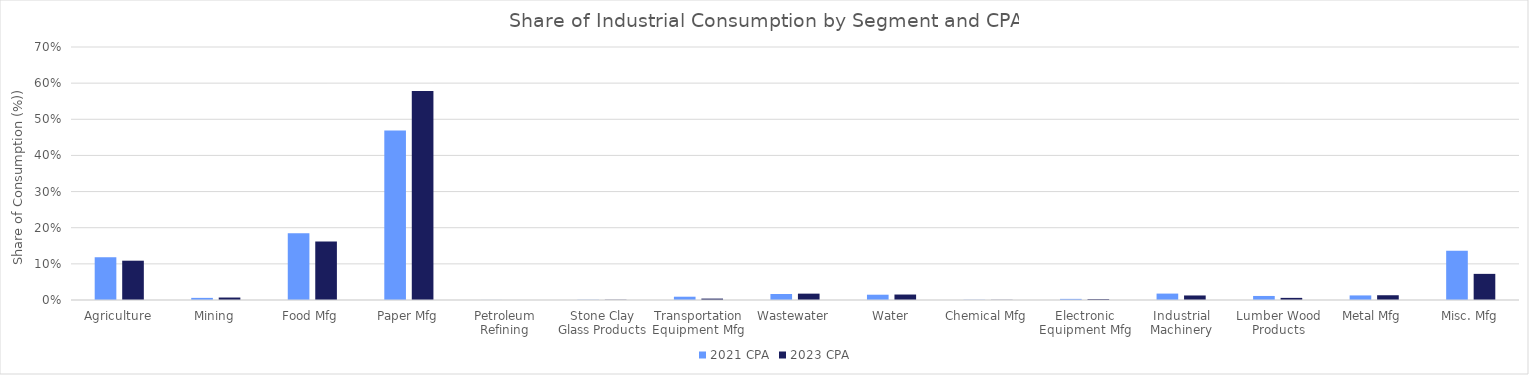
| Category | 2021 CPA | 2023 CPA |
|---|---|---|
| Agriculture | 0.118 | 0.109 |
| Mining | 0.006 | 0.007 |
| Food Mfg | 0.184 | 0.162 |
| Paper Mfg | 0.469 | 0.578 |
| Petroleum Refining | 0 | 0 |
| Stone Clay Glass Products | 0.001 | 0.001 |
| Transportation Equipment Mfg | 0.009 | 0.004 |
| Wastewater | 0.017 | 0.018 |
| Water | 0.015 | 0.015 |
| Chemical Mfg | 0.001 | 0.001 |
| Electronic Equipment Mfg | 0.003 | 0.002 |
| Industrial Machinery | 0.018 | 0.013 |
| Lumber Wood Products | 0.011 | 0.006 |
| Metal Mfg | 0.013 | 0.013 |
| Misc. Mfg | 0.136 | 0.072 |